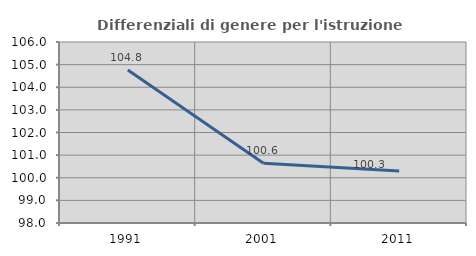
| Category | Differenziali di genere per l'istruzione superiore |
|---|---|
| 1991.0 | 104.764 |
| 2001.0 | 100.643 |
| 2011.0 | 100.297 |